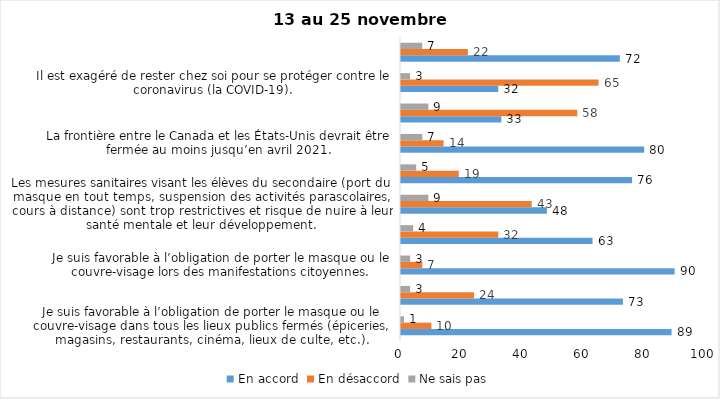
| Category | En accord | En désaccord | Ne sais pas |
|---|---|---|---|
| Je suis favorable à l’obligation de porter le masque ou le couvre-visage dans tous les lieux publics fermés (épiceries, magasins, restaurants, cinéma, lieux de culte, etc.). | 89 | 10 | 1 |
| C’est une bonne chose que les policiers puissent donner facilement des contraventions aux gens qui ne respectent pas les mesures pour prévenir le coronavirus (la COVID-19). | 73 | 24 | 3 |
| Je suis favorable à l’obligation de porter le masque ou le couvre-visage lors des manifestations citoyennes. | 90 | 7 | 3 |
| C’est une bonne chose d’arrêter les activités sportives de groupe (ex. hockey, soccer, yoga, etc.) et de fermer les centres d’entraînement (gyms) dans les zones rouges. | 63 | 32 | 4 |
| Les mesures sanitaires visant les élèves du secondaire (port du masque en tout temps, suspension des activités parascolaires, cours à distance) sont trop restrictives et risque de nuire à leur santé mentale et leur développement. | 48 | 43 | 9 |
| Je suis favorable à l’obligation de porter le masque ou le couvre-visage en tout temps pour les élèves au secondaire. | 76 | 19 | 5 |
| La frontière entre le Canada et les États-Unis devrait être fermée au moins jusqu’en avril 2021. | 80 | 14 | 7 |
| Le gouvernement et les médias exagèrent par rapport au coronavirus (la COVID-19). | 33 | 58 | 9 |
| Il est exagéré de rester chez soi pour se protéger contre le coronavirus (la COVID-19). | 32 | 65 | 3 |
| Les jeunes ne respectent pas les règles de confinement et contribuent à propager la COVID-19. | 72 | 22 | 7 |